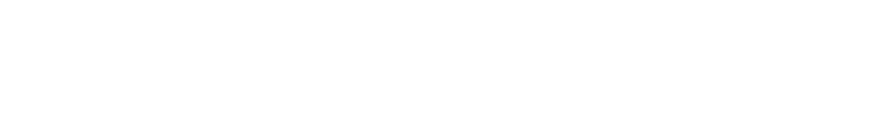
| Category | FINANZIAMENTO TOTALE | SPESE TOTALI |
|---|---|---|
| 0 | 0 | 0 |